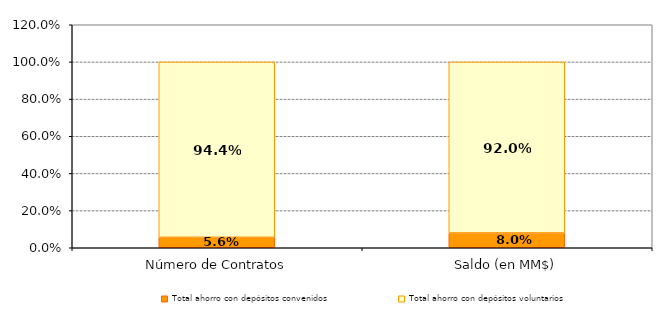
| Category | Total ahorro con depósitos convenidos | Total ahorro con depósitos voluntarios |
|---|---|---|
| Número de Contratos | 0.056 | 0.944 |
| Saldo (en MM$) | 0.08 | 0.92 |